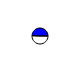
| Category | Series 0 |
|---|---|
| 0 | 2469972 |
| 1 | 2413135 |